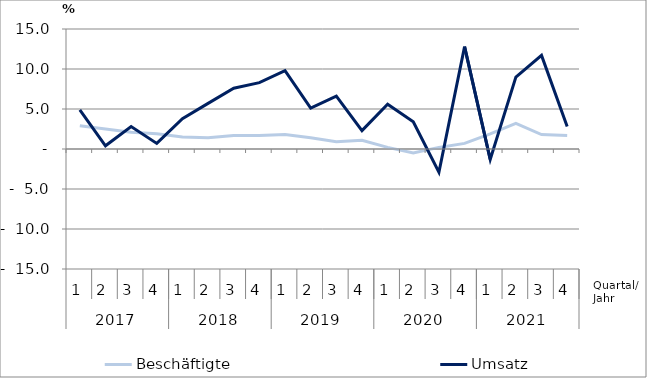
| Category | Beschäftigte | Umsatz |
|---|---|---|
| 0 | 2.9 | 4.9 |
| 1 | 2.5 | 0.4 |
| 2 | 2.1 | 2.8 |
| 3 | 1.9 | 0.7 |
| 4 | 1.5 | 3.8 |
| 5 | 1.4 | 5.7 |
| 6 | 1.7 | 7.6 |
| 7 | 1.7 | 8.3 |
| 8 | 1.8 | 9.8 |
| 9 | 1.4 | 5.1 |
| 10 | 0.9 | 6.6 |
| 11 | 1.1 | 2.3 |
| 12 | 0.2 | 5.6 |
| 13 | -0.5 | 3.4 |
| 14 | 0.2 | -2.9 |
| 15 | 0.7 | 12.8 |
| 16 | 1.9 | -1.3 |
| 17 | 3.2 | 9 |
| 18 | 1.8 | 11.7 |
| 19 | 1.7 | 2.8 |